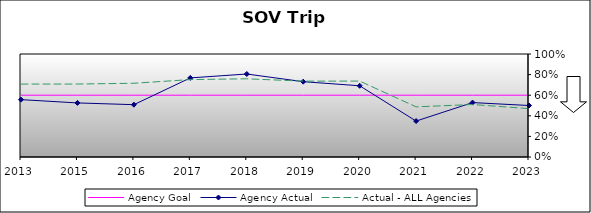
| Category | Agency Goal | Agency Actual | Actual - ALL Agencies |
|---|---|---|---|
| 2013.0 | 0.6 | 0.557 | 0.708 |
| 2015.0 | 0.6 | 0.525 | 0.708 |
| 2016.0 | 0.6 | 0.508 | 0.716 |
| 2017.0 | 0.6 | 0.768 | 0.752 |
| 2018.0 | 0.6 | 0.806 | 0.759 |
| 2019.0 | 0.6 | 0.731 | 0.736 |
| 2020.0 | 0.6 | 0.692 | 0.737 |
| 2021.0 | 0.6 | 0.349 | 0.487 |
| 2022.0 | 0.6 | 0.528 | 0.509 |
| 2023.0 | 0.6 | 0.5 | 0.47 |